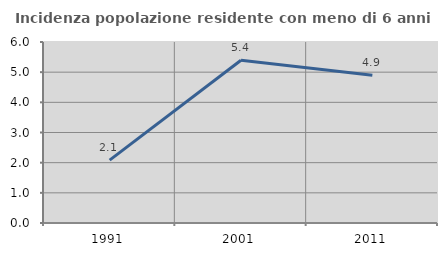
| Category | Incidenza popolazione residente con meno di 6 anni |
|---|---|
| 1991.0 | 2.083 |
| 2001.0 | 5.394 |
| 2011.0 | 4.895 |